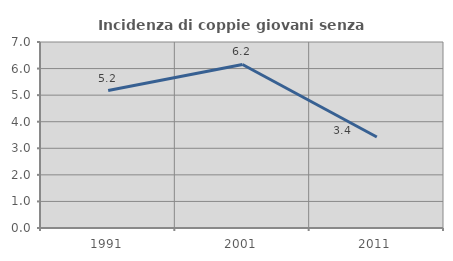
| Category | Incidenza di coppie giovani senza figli |
|---|---|
| 1991.0 | 5.172 |
| 2001.0 | 6.154 |
| 2011.0 | 3.425 |